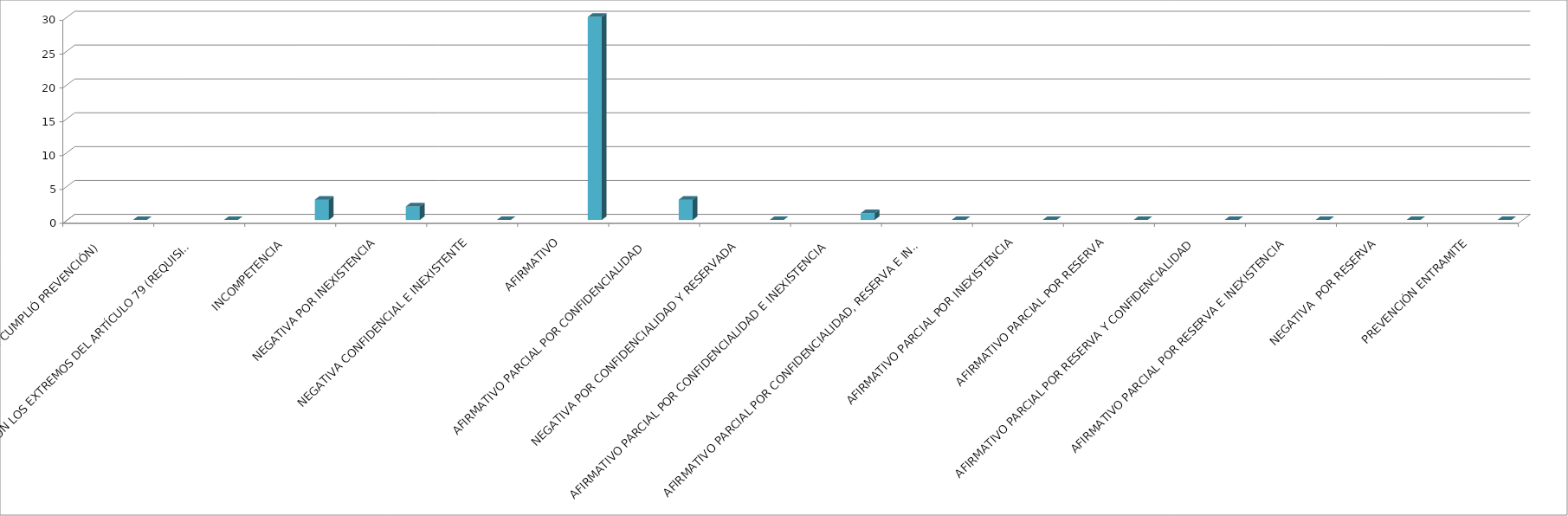
| Category | Series 0 | Series 1 | Series 2 | Series 3 | Series 4 |
|---|---|---|---|---|---|
| SE TIENE POR NO PRESENTADA ( NO CUMPLIÓ PREVENCIÓN) |  |  |  |  | 0 |
| NO CUMPLIO CON LOS EXTREMOS DEL ARTÍCULO 79 (REQUISITOS) |  |  |  |  | 0 |
| INCOMPETENCIA  |  |  |  |  | 3 |
| NEGATIVA POR INEXISTENCIA |  |  |  |  | 2 |
| NEGATIVA CONFIDENCIAL E INEXISTENTE |  |  |  |  | 0 |
| AFIRMATIVO |  |  |  |  | 30 |
| AFIRMATIVO PARCIAL POR CONFIDENCIALIDAD  |  |  |  |  | 3 |
| NEGATIVA POR CONFIDENCIALIDAD Y RESERVADA |  |  |  |  | 0 |
| AFIRMATIVO PARCIAL POR CONFIDENCIALIDAD E INEXISTENCIA |  |  |  |  | 1 |
| AFIRMATIVO PARCIAL POR CONFIDENCIALIDAD, RESERVA E INEXISTENCIA |  |  |  |  | 0 |
| AFIRMATIVO PARCIAL POR INEXISTENCIA |  |  |  |  | 0 |
| AFIRMATIVO PARCIAL POR RESERVA |  |  |  |  | 0 |
| AFIRMATIVO PARCIAL POR RESERVA Y CONFIDENCIALIDAD |  |  |  |  | 0 |
| AFIRMATIVO PARCIAL POR RESERVA E INEXISTENCIA |  |  |  |  | 0 |
| NEGATIVA  POR RESERVA |  |  |  |  | 0 |
| PREVENCIÓN ENTRAMITE |  |  |  |  | 0 |